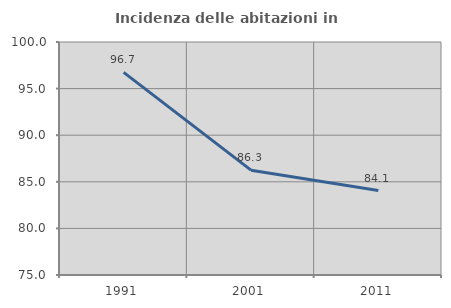
| Category | Incidenza delle abitazioni in proprietà  |
|---|---|
| 1991.0 | 96.739 |
| 2001.0 | 86.25 |
| 2011.0 | 84.058 |